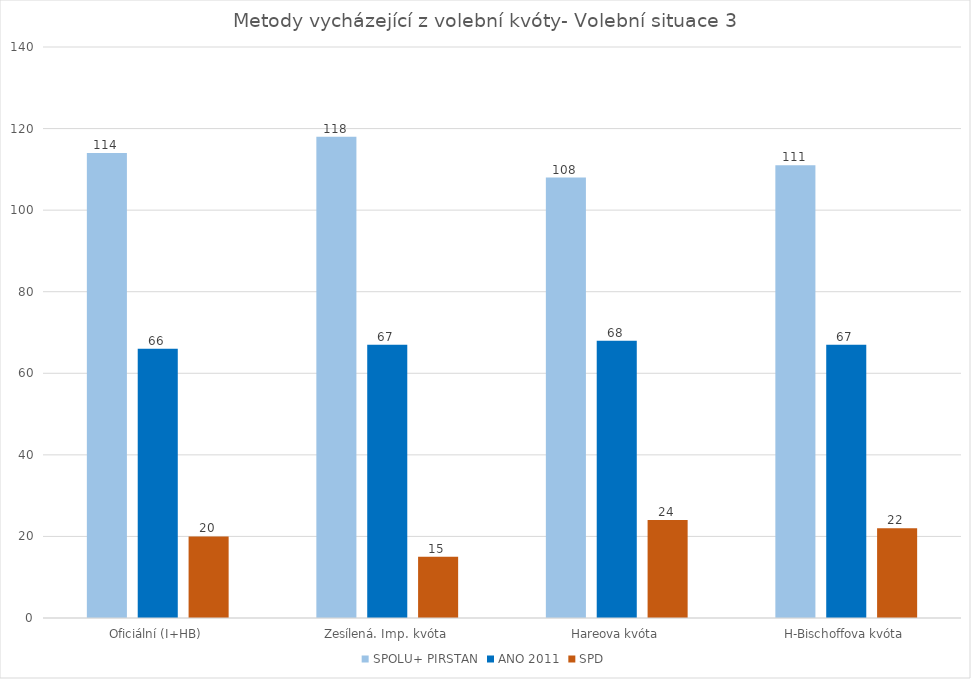
| Category | SPOLU+ PIRSTAN | ANO 2011 | SPD |
|---|---|---|---|
| Oficiální (I+HB) | 114 | 66 | 20 |
| Zesílená. Imp. kvóta | 118 | 67 | 15 |
| Hareova kvóta | 108 | 68 | 24 |
| H-Bischoffova kvóta | 111 | 67 | 22 |